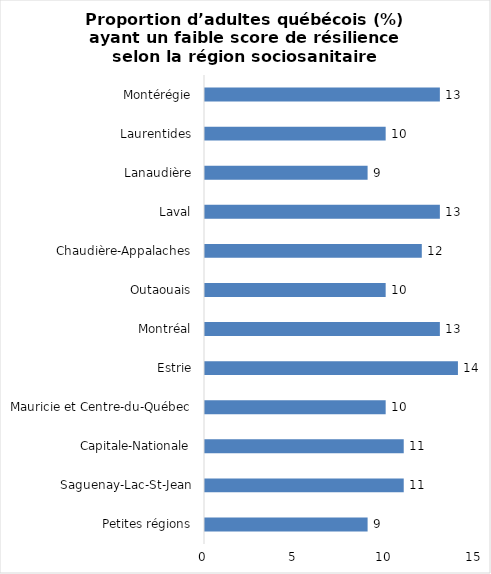
| Category | Series 0 |
|---|---|
| Petites régions | 9 |
| Saguenay-Lac-St-Jean | 11 |
| Capitale-Nationale | 11 |
| Mauricie et Centre-du-Québec | 10 |
| Estrie | 14 |
| Montréal | 13 |
| Outaouais | 10 |
| Chaudière-Appalaches | 12 |
| Laval | 13 |
| Lanaudière | 9 |
| Laurentides | 10 |
| Montérégie | 13 |